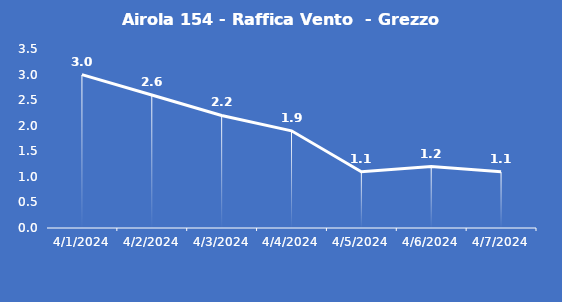
| Category | Airola 154 - Raffica Vento  - Grezzo (m/s) |
|---|---|
| 4/1/24 | 3 |
| 4/2/24 | 2.6 |
| 4/3/24 | 2.2 |
| 4/4/24 | 1.9 |
| 4/5/24 | 1.1 |
| 4/6/24 | 1.2 |
| 4/7/24 | 1.1 |